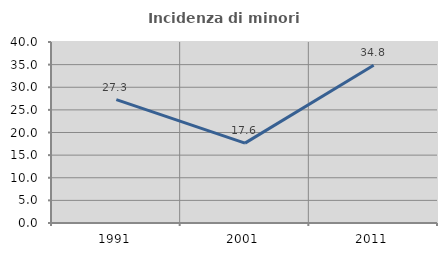
| Category | Incidenza di minori stranieri |
|---|---|
| 1991.0 | 27.273 |
| 2001.0 | 17.647 |
| 2011.0 | 34.848 |